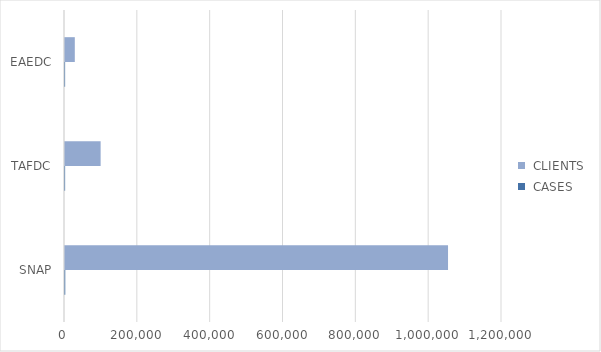
| Category |  CASES |  CLIENTS |
|---|---|---|
| SNAP | 783 | 1051787 |
| TAFDC | 348 | 97842 |
| EAEDC | 332 | 26933 |